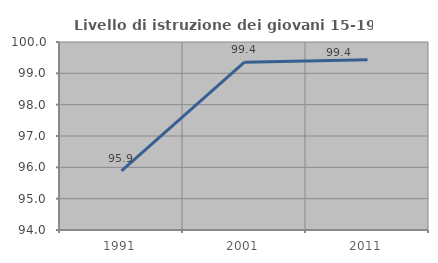
| Category | Livello di istruzione dei giovani 15-19 anni |
|---|---|
| 1991.0 | 95.89 |
| 2001.0 | 99.355 |
| 2011.0 | 99.432 |